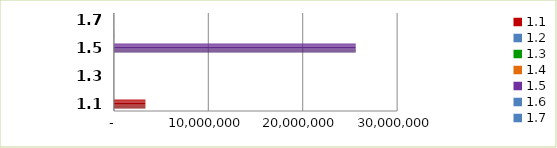
| Category | Series 0 |
|---|---|
| 1.1 | 3337100 |
| 1.2 | 0 |
| 1.3 | 0 |
| 1.4 | 0 |
| 1.5 | 25615731 |
| 1.6 | 22700 |
| 1.7 | 0 |